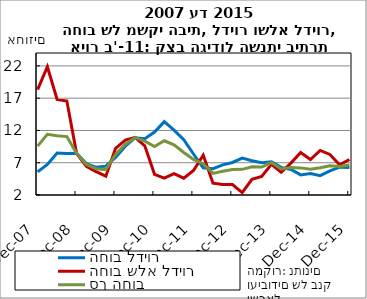
| Category | החוב לדיור | החוב שלא לדיור | סך החוב |
|---|---|---|---|
| 2007-12-31 | 5.583 | 18.318 | 9.569 |
| 2008-03-31 | 6.741 | 21.868 | 11.412 |
| 2008-06-30 | 8.497 | 16.792 | 11.166 |
| 2008-09-30 | 8.412 | 16.558 | 11.05 |
| 2008-12-31 | 8.457 | 8.442 | 8.452 |
| 2009-03-31 | 6.876 | 6.448 | 6.732 |
| 2009-06-30 | 6.284 | 5.625 | 6.061 |
| 2009-09-30 | 6.47 | 4.91 | 5.94 |
| 2009-12-31 | 7.814 | 9.221 | 8.289 |
| 2010-03-31 | 9.555 | 10.497 | 9.872 |
| 2010-06-30 | 10.859 | 10.933 | 10.884 |
| 2010-09-30 | 10.723 | 9.624 | 10.353 |
| 2010-12-31 | 11.744 | 5.21 | 9.516 |
| 2011-03-31 | 13.368 | 4.613 | 10.402 |
| 2011-06-30 | 12.054 | 5.318 | 9.785 |
| 2011-09-30 | 10.58 | 4.612 | 8.584 |
| 2011-12-31 | 8.355 | 5.801 | 7.519 |
| 2012-03-31 | 6.214 | 8.177 | 6.844 |
| 2012-06-30 | 6.08 | 3.822 | 5.35 |
| 2012-09-30 | 6.663 | 3.621 | 5.683 |
| 2012-12-31 | 7.042 | 3.613 | 5.937 |
| 2013-03-31 | 7.71 | 2.38 | 5.978 |
| 2013-06-30 | 7.3 | 4.433 | 6.387 |
| 2013-09-30 | 6.989 | 4.879 | 6.323 |
| 2013-12-31 | 7.144 | 6.759 | 7.023 |
| 2014-03-31 | 6.28 | 5.507 | 6.037 |
| 2014-06-30 | 5.959 | 6.94 | 6.266 |
| 2014-09-30 | 5.119 | 8.592 | 6.201 |
| 2014-12-31 | 5.316 | 7.499 | 6.002 |
| 2015-03-31 | 4.998 | 8.904 | 6.218 |
| 2015-06-30 | 5.724 | 8.282 | 6.529 |
| 2015-09-30 | 6.306 | 6.668 | 6.422 |
| 2015-12-31 | 6.264 | 7.503 | 6.659 |